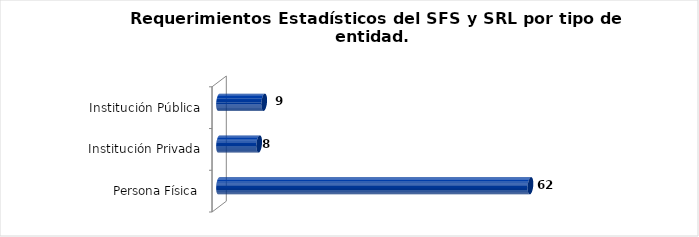
| Category | Total |
|---|---|
| Persona Física | 62 |
| Institución Privada | 8 |
| Institución Pública | 9 |